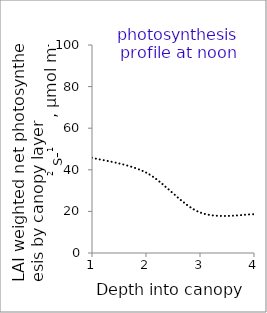
| Category | profile |
|---|---|
| 1.0 | 45.813 |
| 2.0 | 38.679 |
| 3.0 | 19.512 |
| 4.0 | 18.622 |